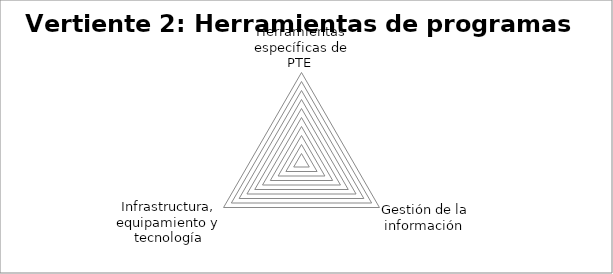
| Category | Series 0 |
|---|---|
| Herramientas específicas de PTE  | 0 |
| Gestión de la información  | 0 |
| Infrastructura, equipamiento y tecnología | 0 |